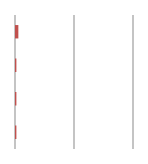
| Category | Series 0 |
|---|---|
| 0 | 0.02 |
| 1 | 0.003 |
| 2 | 0.003 |
| 3 | 0.003 |